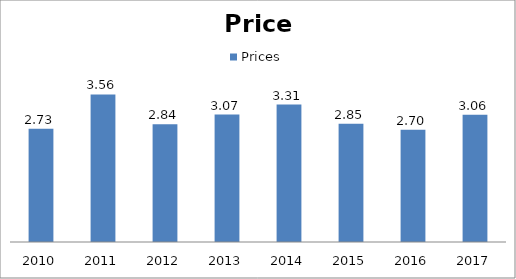
| Category | Prices |
|---|---|
| 2010.0 | 2.728 |
| 2011.0 | 3.555 |
| 2012.0 | 2.836 |
| 2013.0 | 3.07 |
| 2014.0 | 3.311 |
| 2015.0 | 2.848 |
| 2016.0 | 2.704 |
| 2017.0 | 3.065 |